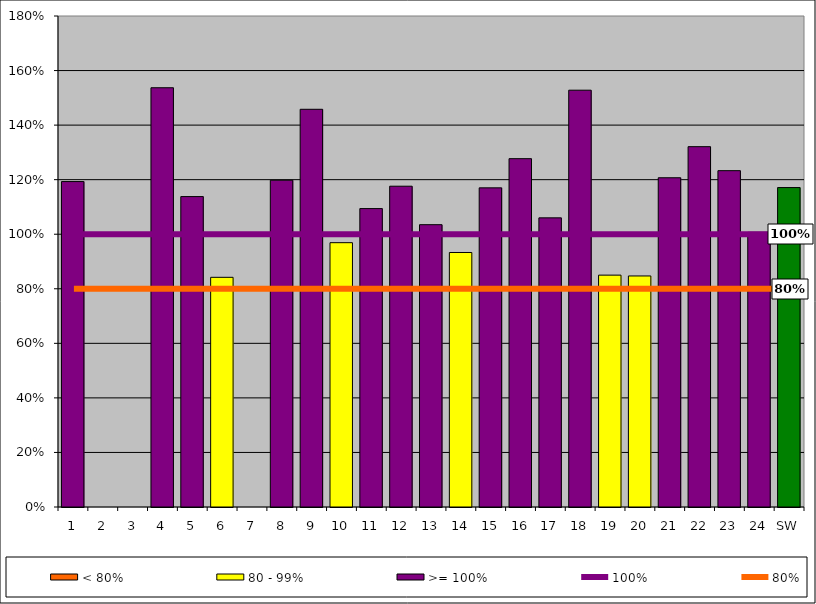
| Category | < 80% | 80 - 99% | >= 100% |
|---|---|---|---|
| 1 | 0 | 0 | 1.193 |
| 2 | 0 | 0 | 0 |
| 3 | 0 | 0 | 0 |
| 4 | 0 | 0 | 1.537 |
| 5 | 0 | 0 | 1.138 |
| 6 | 0 | 0.842 | 0 |
| 7 | 0 | 0 | 0 |
| 8 | 0 | 0 | 1.198 |
| 9 | 0 | 0 | 1.458 |
| 10 | 0 | 0.969 | 0 |
| 11 | 0 | 0 | 1.094 |
| 12 | 0 | 0 | 1.176 |
| 13 | 0 | 0 | 1.035 |
| 14 | 0 | 0.933 | 0 |
| 15 | 0 | 0 | 1.17 |
| 16 | 0 | 0 | 1.277 |
| 17 | 0 | 0 | 1.06 |
| 18 | 0 | 0 | 1.528 |
| 19 | 0 | 0.85 | 0 |
| 20 | 0 | 0.847 | 0 |
| 21 | 0 | 0 | 1.207 |
| 22 | 0 | 0 | 1.321 |
| 23 | 0 | 0 | 1.233 |
| 24 | 0 | 0 | 1.007 |
| SW | 0 | 0 | 1.171 |